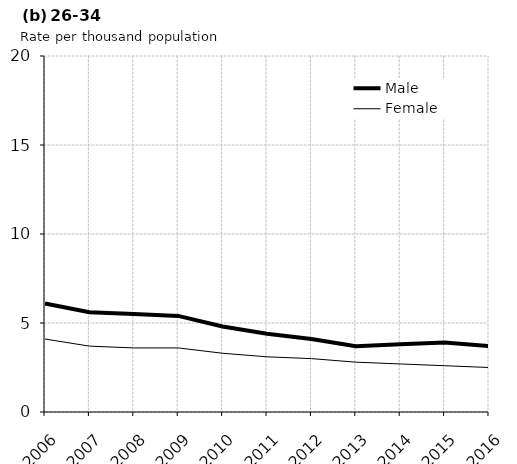
| Category | Male | Female |
|---|---|---|
| 2006.0 | 6.1 | 4.1 |
| 2007.0 | 5.6 | 3.7 |
| 2008.0 | 5.5 | 3.6 |
| 2009.0 | 5.4 | 3.6 |
| 2010.0 | 4.8 | 3.3 |
| 2011.0 | 4.4 | 3.1 |
| 2012.0 | 4.1 | 3 |
| 2013.0 | 3.7 | 2.8 |
| 2014.0 | 3.8 | 2.7 |
| 2015.0 | 3.9 | 2.6 |
| 2016.0 | 3.7 | 2.5 |